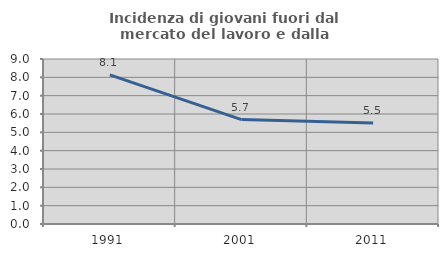
| Category | Incidenza di giovani fuori dal mercato del lavoro e dalla formazione  |
|---|---|
| 1991.0 | 8.13 |
| 2001.0 | 5.695 |
| 2011.0 | 5.507 |